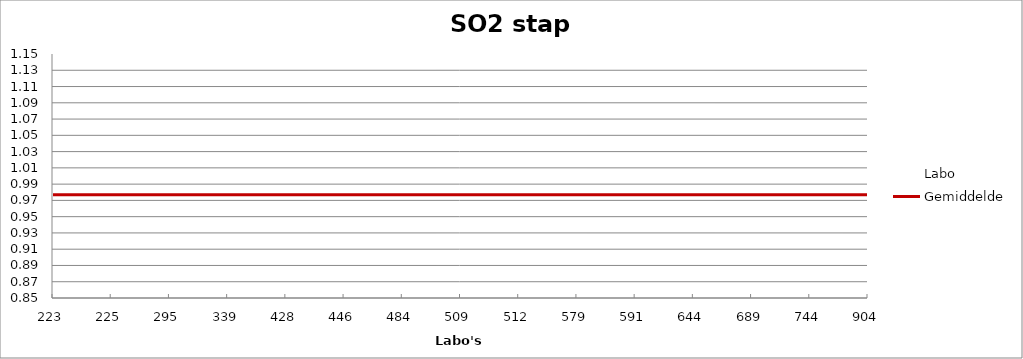
| Category | Labo | Gemiddelde |
|---|---|---|
| 223.0 | 1.036 | 0.977 |
| 225.0 | 0.99 | 0.977 |
| 295.0 | 0.962 | 0.977 |
| 339.0 | 0.876 | 0.977 |
| 428.0 | 1.129 | 0.977 |
| 446.0 | 0.934 | 0.977 |
| 484.0 | 0.99 | 0.977 |
| 509.0 | 0.953 | 0.977 |
| 512.0 | 0.971 | 0.977 |
| 579.0 | 0.962 | 0.977 |
| 591.0 | 0.981 | 0.977 |
| 644.0 | 0.962 | 0.977 |
| 689.0 | 0.99 | 0.977 |
| 744.0 | 1.036 | 0.977 |
| 904.0 | 0.934 | 0.977 |